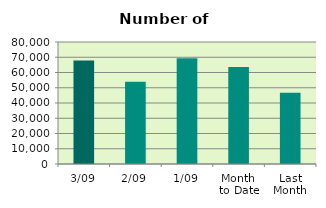
| Category | Series 0 |
|---|---|
| 3/09 | 67812 |
| 2/09 | 53932 |
| 1/09 | 69310 |
| Month 
to Date | 63684.667 |
| Last
Month | 46763.238 |